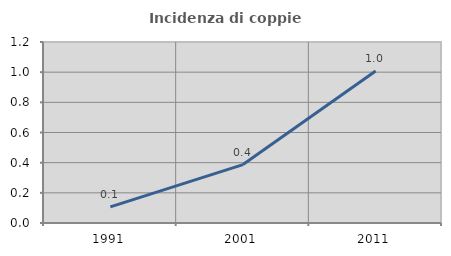
| Category | Incidenza di coppie miste |
|---|---|
| 1991.0 | 0.107 |
| 2001.0 | 0.387 |
| 2011.0 | 1.007 |